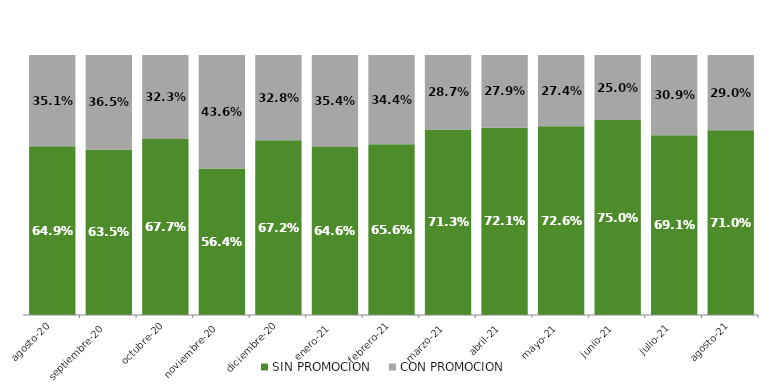
| Category | SIN PROMOCION   | CON PROMOCION   |
|---|---|---|
| 2020-08-01 | 0.649 | 0.351 |
| 2020-09-01 | 0.635 | 0.365 |
| 2020-10-01 | 0.677 | 0.323 |
| 2020-11-01 | 0.564 | 0.436 |
| 2020-12-01 | 0.672 | 0.328 |
| 2021-01-01 | 0.646 | 0.354 |
| 2021-02-01 | 0.656 | 0.344 |
| 2021-03-01 | 0.713 | 0.287 |
| 2021-04-01 | 0.721 | 0.279 |
| 2021-05-01 | 0.726 | 0.274 |
| 2021-06-01 | 0.75 | 0.25 |
| 2021-07-01 | 0.691 | 0.309 |
| 2021-08-01 | 0.71 | 0.29 |